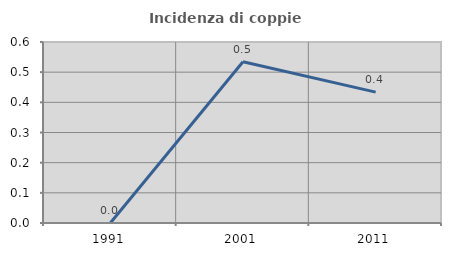
| Category | Incidenza di coppie miste |
|---|---|
| 1991.0 | 0 |
| 2001.0 | 0.535 |
| 2011.0 | 0.434 |